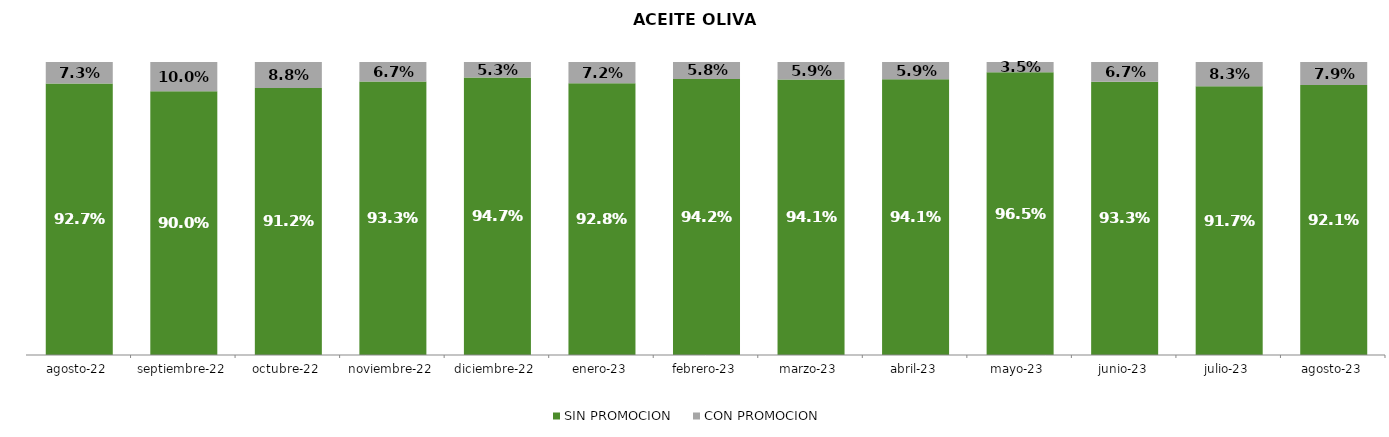
| Category | SIN PROMOCION   | CON PROMOCION   |
|---|---|---|
| 2022-08-01 | 0.927 | 0.073 |
| 2022-09-01 | 0.9 | 0.1 |
| 2022-10-01 | 0.912 | 0.088 |
| 2022-11-01 | 0.933 | 0.067 |
| 2022-12-01 | 0.947 | 0.053 |
| 2023-01-01 | 0.928 | 0.072 |
| 2023-02-01 | 0.942 | 0.058 |
| 2023-03-01 | 0.941 | 0.059 |
| 2023-04-01 | 0.941 | 0.059 |
| 2023-05-01 | 0.965 | 0.035 |
| 2023-06-01 | 0.933 | 0.067 |
| 2023-07-01 | 0.917 | 0.083 |
| 2023-08-01 | 0.921 | 0.079 |